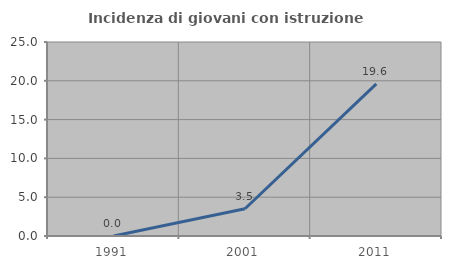
| Category | Incidenza di giovani con istruzione universitaria |
|---|---|
| 1991.0 | 0 |
| 2001.0 | 3.509 |
| 2011.0 | 19.608 |